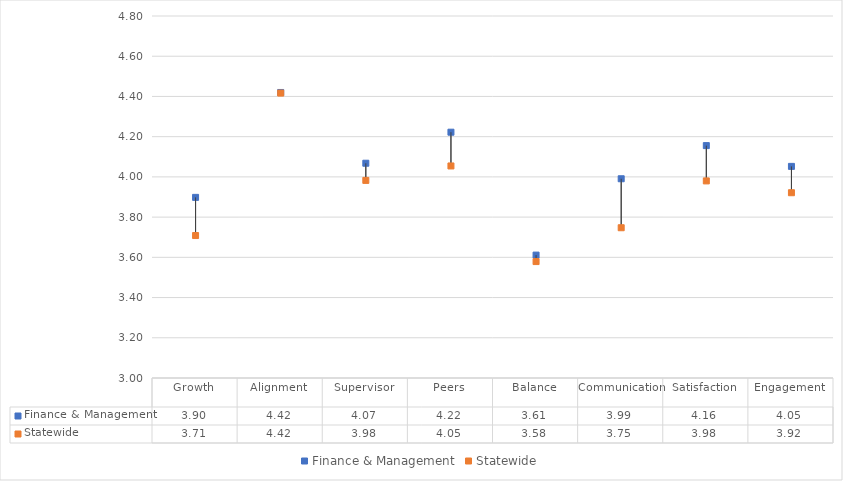
| Category | Finance & Management | Statewide |
|---|---|---|
| Growth | 3.898 | 3.708 |
| Alignment | 4.42 | 4.417 |
| Supervisor | 4.068 | 3.983 |
| Peers | 4.222 | 4.054 |
| Balance | 3.611 | 3.579 |
| Communication | 3.991 | 3.747 |
| Satisfaction | 4.156 | 3.98 |
| Engagement | 4.052 | 3.921 |